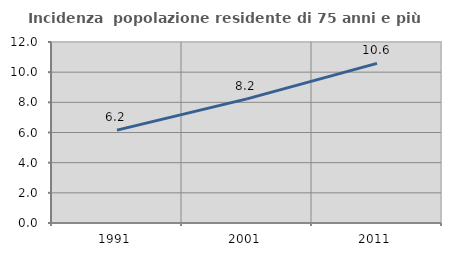
| Category | Incidenza  popolazione residente di 75 anni e più |
|---|---|
| 1991.0 | 6.156 |
| 2001.0 | 8.231 |
| 2011.0 | 10.581 |